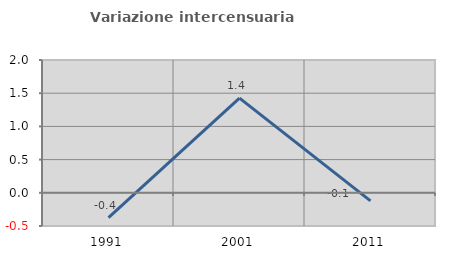
| Category | Variazione intercensuaria annua |
|---|---|
| 1991.0 | -0.374 |
| 2001.0 | 1.426 |
| 2011.0 | -0.123 |